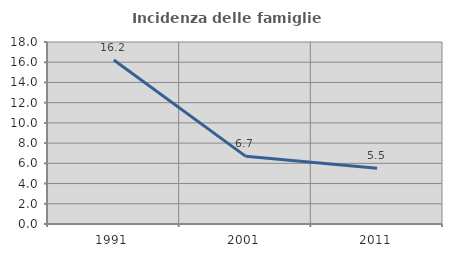
| Category | Incidenza delle famiglie numerose |
|---|---|
| 1991.0 | 16.216 |
| 2001.0 | 6.71 |
| 2011.0 | 5.515 |